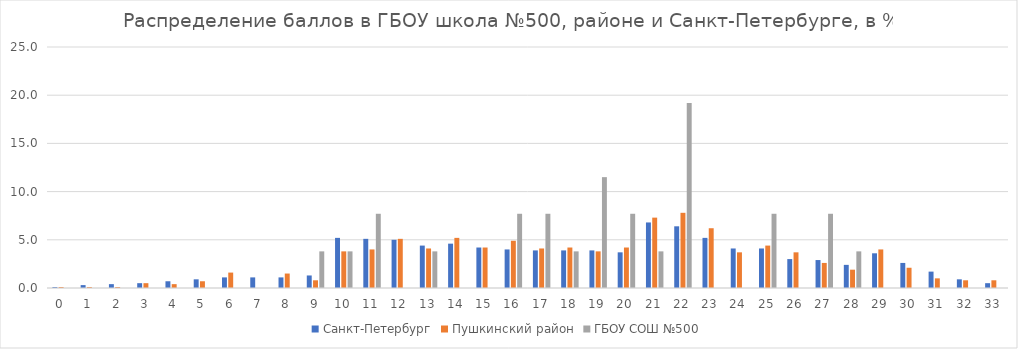
| Category | Санкт-Петербург | Пушкинский район | ГБОУ СОШ №500 |
|---|---|---|---|
| 0.0 | 0.1 | 0.1 | 0 |
| 1.0 | 0.3 | 0.1 | 0 |
| 2.0 | 0.4 | 0.1 | 0 |
| 3.0 | 0.5 | 0.5 | 0 |
| 4.0 | 0.7 | 0.4 | 0 |
| 5.0 | 0.9 | 0.7 | 0 |
| 6.0 | 1.1 | 1.6 | 0 |
| 7.0 | 1.1 | 0 | 0 |
| 8.0 | 1.1 | 1.5 | 0 |
| 9.0 | 1.3 | 0.8 | 3.8 |
| 10.0 | 5.2 | 3.8 | 3.8 |
| 11.0 | 5.1 | 4 | 7.7 |
| 12.0 | 5 | 5.1 | 0 |
| 13.0 | 4.4 | 4.1 | 3.8 |
| 14.0 | 4.6 | 5.2 | 0 |
| 15.0 | 4.2 | 4.2 | 0 |
| 16.0 | 4 | 4.9 | 7.7 |
| 17.0 | 3.9 | 4.1 | 7.7 |
| 18.0 | 3.9 | 4.2 | 3.8 |
| 19.0 | 3.9 | 3.8 | 11.5 |
| 20.0 | 3.7 | 4.2 | 7.7 |
| 21.0 | 6.8 | 7.3 | 3.8 |
| 22.0 | 6.4 | 7.8 | 19.2 |
| 23.0 | 5.2 | 6.2 | 0 |
| 24.0 | 4.1 | 3.7 | 0 |
| 25.0 | 4.1 | 4.4 | 7.7 |
| 26.0 | 3 | 3.7 | 0 |
| 27.0 | 2.9 | 2.6 | 7.7 |
| 28.0 | 2.4 | 1.9 | 3.8 |
| 29.0 | 3.6 | 4 | 0 |
| 30.0 | 2.6 | 2.1 | 0 |
| 31.0 | 1.7 | 1 | 0 |
| 32.0 | 0.9 | 0.8 | 0 |
| 33.0 | 0.5 | 0.8 | 0 |